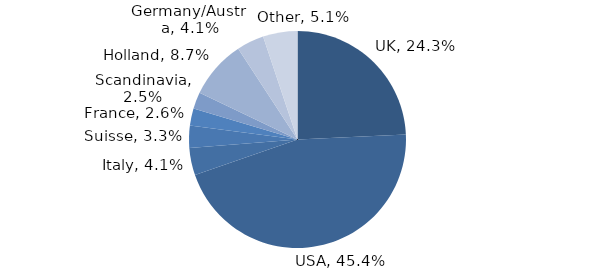
| Category | Investment Style |
|---|---|
| UK | 0.243 |
| USA | 0.454 |
| Italy | 0.041 |
| Suisse | 0.033 |
| France | 0.026 |
| Scandinavia | 0.025 |
| Holland | 0.087 |
| Germany/Austria | 0.041 |
| Other | 0.051 |